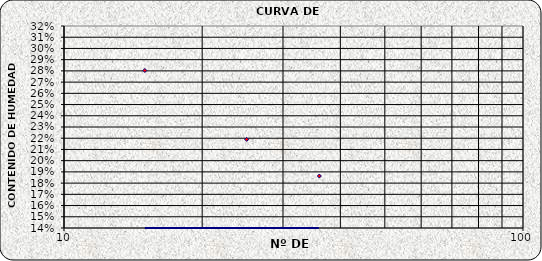
| Category | Series 0 |
|---|---|
| 36.0 | 0.186 |
| 25.0 | 0.219 |
| 15.0 | 0.28 |